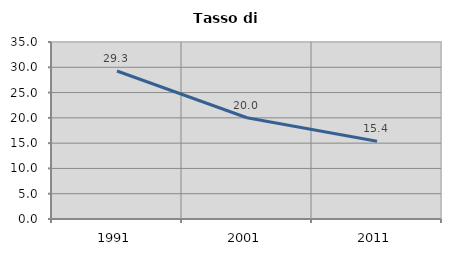
| Category | Tasso di disoccupazione   |
|---|---|
| 1991.0 | 29.268 |
| 2001.0 | 20.025 |
| 2011.0 | 15.385 |